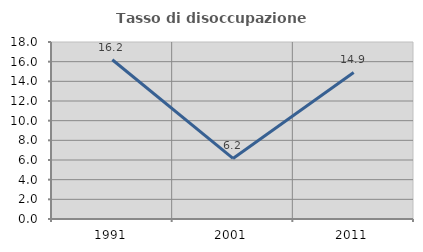
| Category | Tasso di disoccupazione giovanile  |
|---|---|
| 1991.0 | 16.193 |
| 2001.0 | 6.159 |
| 2011.0 | 14.904 |